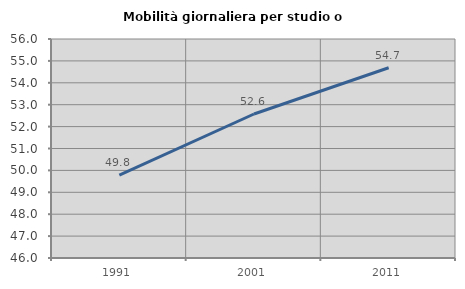
| Category | Mobilità giornaliera per studio o lavoro |
|---|---|
| 1991.0 | 49.781 |
| 2001.0 | 52.575 |
| 2011.0 | 54.687 |